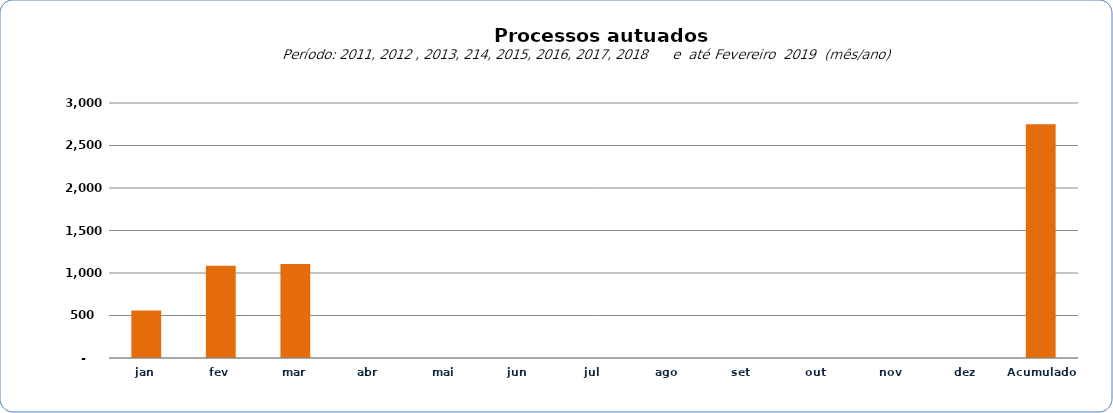
| Category |  6.735  |
|---|---|
| jan | 560 |
| fev | 1085 |
| mar | 1105 |
| abr | 0 |
| mai | 0 |
| jun | 0 |
| jul | 0 |
| ago | 0 |
| set | 0 |
| out | 0 |
| nov | 0 |
| dez | 0 |
| Acumulado
 | 2749 |